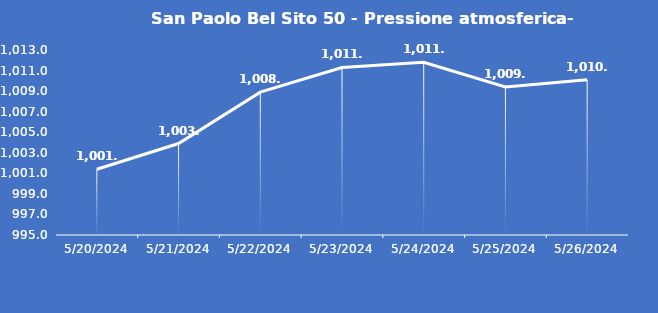
| Category | San Paolo Bel Sito 50 - Pressione atmosferica- Grezzo (hPa) |
|---|---|
| 5/20/24 | 1001.4 |
| 5/21/24 | 1003.9 |
| 5/22/24 | 1008.9 |
| 5/23/24 | 1011.3 |
| 5/24/24 | 1011.8 |
| 5/25/24 | 1009.4 |
| 5/26/24 | 1010.1 |